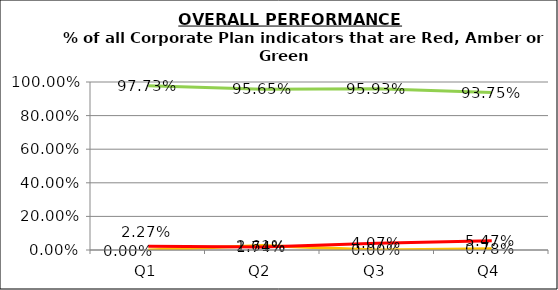
| Category | Green | Amber | Red |
|---|---|---|---|
| Q1 | 0.977 | 0 | 0.023 |
| Q2 | 0.957 | 0.026 | 0.017 |
| Q3 | 0.959 | 0 | 0.041 |
| Q4 | 0.938 | 0.008 | 0.055 |